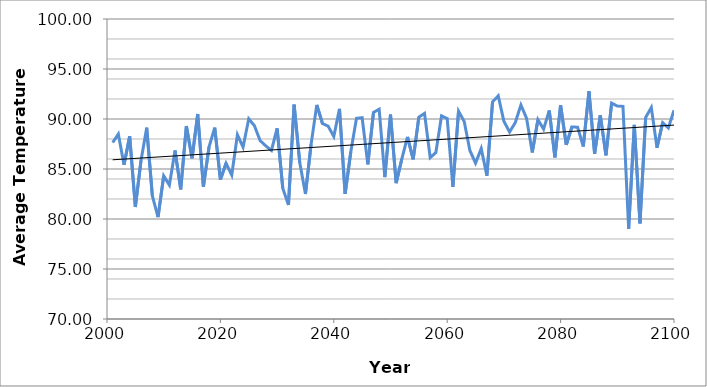
| Category | B1 |
|---|---|
| 2001.0 | 87.643 |
| 2002.0 | 88.489 |
| 2003.0 | 85.419 |
| 2004.0 | 88.281 |
| 2005.0 | 81.205 |
| 2006.0 | 85.856 |
| 2007.0 | 89.127 |
| 2008.0 | 82.301 |
| 2009.0 | 80.184 |
| 2010.0 | 84.308 |
| 2011.0 | 83.386 |
| 2012.0 | 86.859 |
| 2013.0 | 82.965 |
| 2014.0 | 89.29 |
| 2015.0 | 86.067 |
| 2016.0 | 90.498 |
| 2017.0 | 83.215 |
| 2018.0 | 87.229 |
| 2019.0 | 89.132 |
| 2020.0 | 83.932 |
| 2021.0 | 85.573 |
| 2022.0 | 84.389 |
| 2023.0 | 88.423 |
| 2024.0 | 87.183 |
| 2025.0 | 90.014 |
| 2026.0 | 89.328 |
| 2027.0 | 87.843 |
| 2028.0 | 87.314 |
| 2029.0 | 86.855 |
| 2030.0 | 89.065 |
| 2031.0 | 83.084 |
| 2032.0 | 81.41 |
| 2033.0 | 91.434 |
| 2034.0 | 85.618 |
| 2035.0 | 82.499 |
| 2036.0 | 87.49 |
| 2037.0 | 91.409 |
| 2038.0 | 89.546 |
| 2039.0 | 89.285 |
| 2040.0 | 88.25 |
| 2041.0 | 91.015 |
| 2042.0 | 82.519 |
| 2043.0 | 86.722 |
| 2044.0 | 90.066 |
| 2045.0 | 90.129 |
| 2046.0 | 85.462 |
| 2047.0 | 90.666 |
| 2048.0 | 90.981 |
| 2049.0 | 84.177 |
| 2050.0 | 90.437 |
| 2051.0 | 83.586 |
| 2052.0 | 86.009 |
| 2053.0 | 88.203 |
| 2054.0 | 85.966 |
| 2055.0 | 90.183 |
| 2056.0 | 90.563 |
| 2057.0 | 86.137 |
| 2058.0 | 86.644 |
| 2059.0 | 90.315 |
| 2060.0 | 90.045 |
| 2061.0 | 83.212 |
| 2062.0 | 90.788 |
| 2063.0 | 89.746 |
| 2064.0 | 86.857 |
| 2065.0 | 85.588 |
| 2066.0 | 87.04 |
| 2067.0 | 84.33 |
| 2068.0 | 91.715 |
| 2069.0 | 92.314 |
| 2070.0 | 89.769 |
| 2071.0 | 88.702 |
| 2072.0 | 89.634 |
| 2073.0 | 91.4 |
| 2074.0 | 90.066 |
| 2075.0 | 86.653 |
| 2076.0 | 89.933 |
| 2077.0 | 88.988 |
| 2078.0 | 90.847 |
| 2079.0 | 86.167 |
| 2080.0 | 91.375 |
| 2081.0 | 87.409 |
| 2082.0 | 89.209 |
| 2083.0 | 89.175 |
| 2084.0 | 87.249 |
| 2085.0 | 92.77 |
| 2086.0 | 86.511 |
| 2087.0 | 90.387 |
| 2088.0 | 86.369 |
| 2089.0 | 91.591 |
| 2090.0 | 91.299 |
| 2091.0 | 91.267 |
| 2092.0 | 79 |
| 2093.0 | 89.406 |
| 2094.0 | 79.56 |
| 2095.0 | 90.149 |
| 2096.0 | 91.152 |
| 2097.0 | 87.129 |
| 2098.0 | 89.629 |
| 2099.0 | 89.109 |
| 2100.0 | 90.869 |